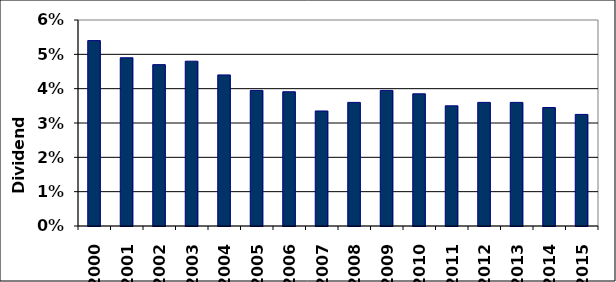
| Category | Series 0 |
|---|---|
| 2000.0 | 0.054 |
| 2001.0 | 0.049 |
| 2002.0 | 0.047 |
| 2003.0 | 0.048 |
| 2004.0 | 0.044 |
| 2005.0 | 0.04 |
| 2006.0 | 0.039 |
| 2007.0 | 0.034 |
| 2008.0 | 0.036 |
| 2009.0 | 0.04 |
| 2010.0 | 0.038 |
| 2011.0 | 0.035 |
| 2012.0 | 0.036 |
| 2013.0 | 0.036 |
| 2014.0 | 0.034 |
| 2015.0 | 0.032 |